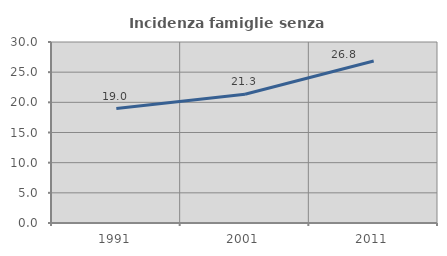
| Category | Incidenza famiglie senza nuclei |
|---|---|
| 1991.0 | 18.967 |
| 2001.0 | 21.344 |
| 2011.0 | 26.848 |